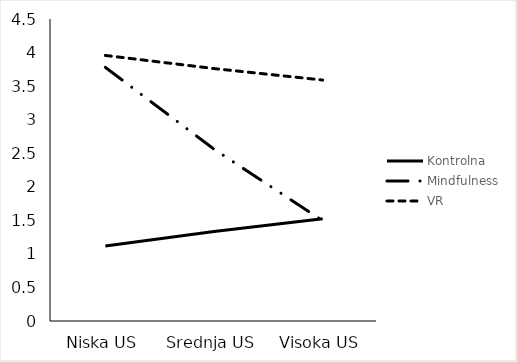
| Category | Kontrolna | Mindfulness | VR |
|---|---|---|---|
| Niska US | 1.119 | 3.78 | 3.957 |
| Srednja US | 1.334 | 2.56 | 3.762 |
| Visoka US | 1.523 | 1.494 | 3.59 |